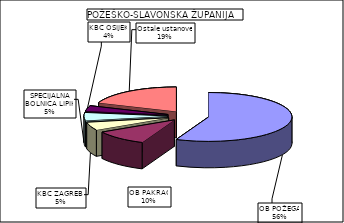
| Category | Series 0 |
|---|---|
| OB POŽEGA | 56.331 |
| OB PAKRAC | 10.374 |
| KBC ZAGREB  | 5.327 |
| SPECIJALNA BOLNICA LIPIK | 5.292 |
| KBC OSIJEK | 3.537 |
| Ostale ustanove | 19.141 |